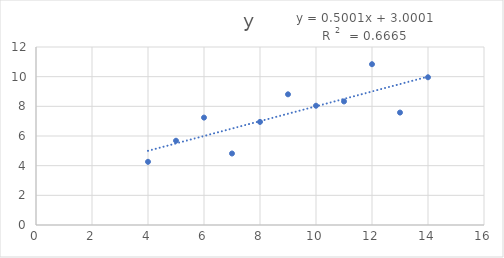
| Category | y |
|---|---|
| 10.0 | 8.04 |
| 8.0 | 6.95 |
| 13.0 | 7.58 |
| 9.0 | 8.81 |
| 11.0 | 8.33 |
| 14.0 | 9.96 |
| 6.0 | 7.24 |
| 4.0 | 4.26 |
| 12.0 | 10.84 |
| 7.0 | 4.82 |
| 5.0 | 5.68 |